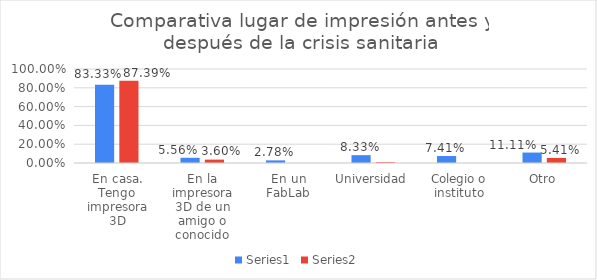
| Category | Series 0 | Series 1 |
|---|---|---|
| En casa. Tengo impresora 3D | 0.833 | 0.874 |
| En la impresora 3D de un amigo o conocido | 0.056 | 0.036 |
| En un FabLab | 0.028 | 0 |
| Universidad | 0.083 | 0.009 |
| Colegio o instituto | 0.074 | 0 |
| Otro | 0.111 | 0.054 |